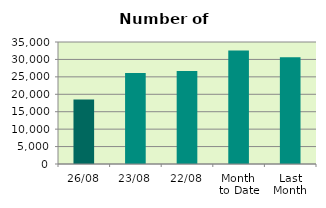
| Category | Series 0 |
|---|---|
| 26/08 | 18522 |
| 23/08 | 26102 |
| 22/08 | 26682 |
| Month 
to Date | 32537.222 |
| Last
Month | 30613.13 |